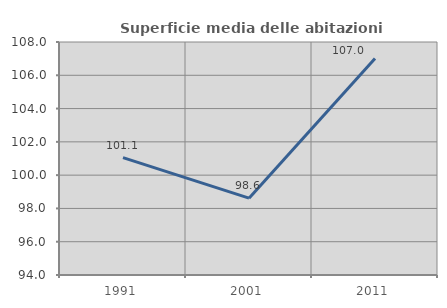
| Category | Superficie media delle abitazioni occupate |
|---|---|
| 1991.0 | 101.052 |
| 2001.0 | 98.616 |
| 2011.0 | 107.014 |